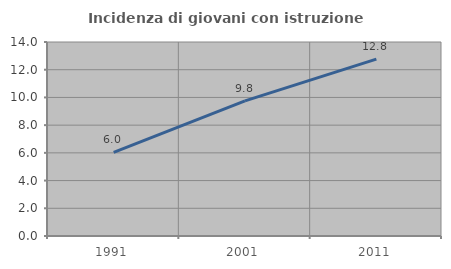
| Category | Incidenza di giovani con istruzione universitaria |
|---|---|
| 1991.0 | 6.034 |
| 2001.0 | 9.756 |
| 2011.0 | 12.766 |